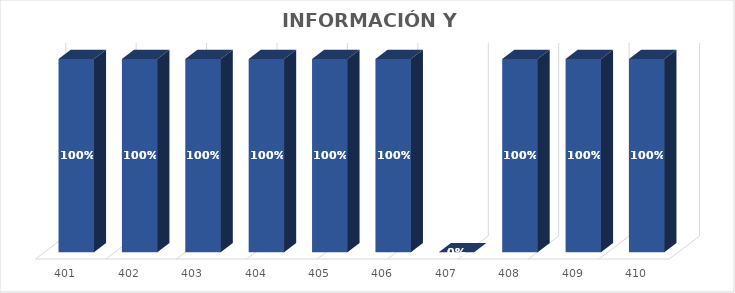
| Category | % Avance |
|---|---|
| 401.0 | 1 |
| 402.0 | 1 |
| 403.0 | 1 |
| 404.0 | 1 |
| 405.0 | 1 |
| 406.0 | 1 |
| 407.0 | 0 |
| 408.0 | 1 |
| 409.0 | 1 |
| 410.0 | 1 |